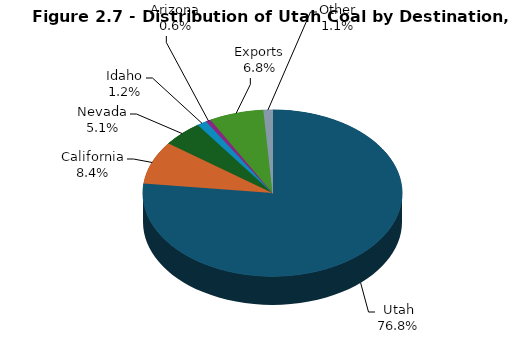
| Category | Series 0 |
|---|---|
| Utah | 12545 |
| California | 1364 |
| Nevada | 825 |
| Idaho | 199 |
| Arizona | 100 |
| Exports | 1110 |
| Other | 185 |